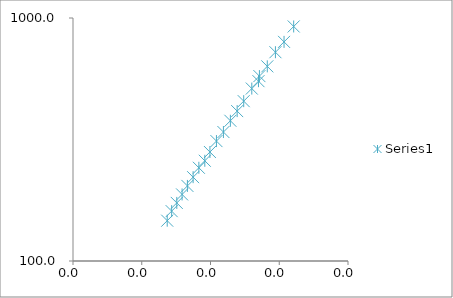
| Category | Series 4 |
|---|---|
| 0.00360490266762797 | 923 |
| 0.00353481795687522 | 797.5 |
| 0.00347222222222222 | 723.1 |
| 0.00341296928327645 | 632.4 |
| 0.00335570469798658 | 576.6 |
| 0.00334896182183523 | 549.6 |
| 0.0033003300330033 | 512.4 |
| 0.00324149108589951 | 454.8 |
| 0.00319386777387416 | 413.9 |
| 0.00314465408805031 | 377.6 |
| 0.00309405940594059 | 339.4 |
| 0.00304321363359708 | 311.5 |
| 0.00299580587177951 | 280.9 |
| 0.0029585798816568 | 258.5 |
| 0.00291545189504373 | 241.9 |
| 0.0028735632183908 | 221.3 |
| 0.00283205890682526 | 203.7 |
| 0.00279329608938547 | 187.9 |
| 0.00275482093663912 | 173.4 |
| 0.00271739130434783 | 160.4 |
| 0.00268528464017186 | 146.5 |